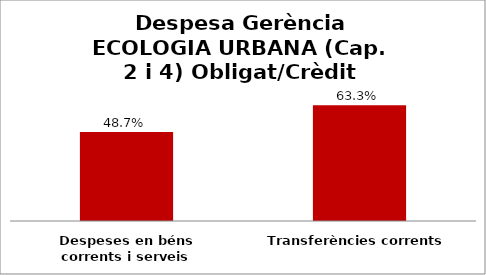
| Category | Series 0 |
|---|---|
| Despeses en béns corrents i serveis | 0.487 |
| Transferències corrents | 0.633 |